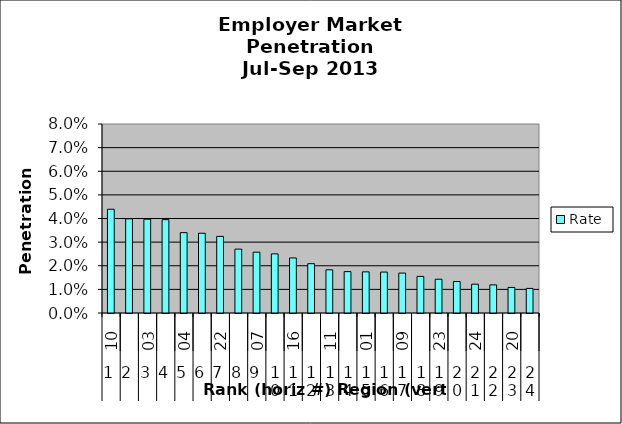
| Category | Rate |
|---|---|
| 0 | 0.044 |
| 1 | 0.04 |
| 2 | 0.04 |
| 3 | 0.04 |
| 4 | 0.034 |
| 5 | 0.034 |
| 6 | 0.032 |
| 7 | 0.027 |
| 8 | 0.026 |
| 9 | 0.025 |
| 10 | 0.023 |
| 11 | 0.021 |
| 12 | 0.018 |
| 13 | 0.018 |
| 14 | 0.017 |
| 15 | 0.017 |
| 16 | 0.017 |
| 17 | 0.016 |
| 18 | 0.014 |
| 19 | 0.013 |
| 20 | 0.012 |
| 21 | 0.012 |
| 22 | 0.011 |
| 23 | 0.01 |